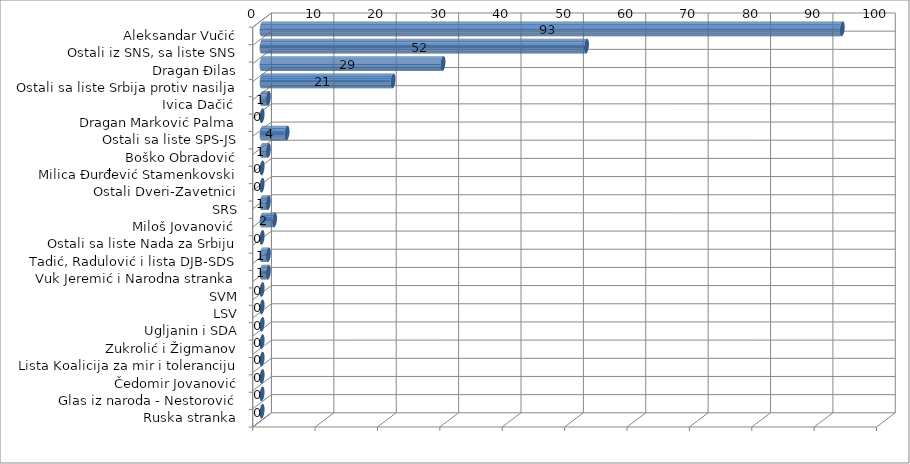
| Category | Series 0 |
|---|---|
| Aleksandar Vučić | 93 |
| Ostali iz SNS, sa liste SNS | 52 |
| Dragan Đilas | 29 |
| Ostali sa liste Srbija protiv nasilja | 21 |
| Ivica Dačić  | 1 |
| Dragan Marković Palma | 0 |
| Ostali sa liste SPS-JS | 4 |
| Boško Obradović | 1 |
| Milica Đurđević Stamenkovski | 0 |
| Ostali Dveri-Zavetnici | 0 |
| SRS | 1 |
| Miloš Jovanović  | 2 |
| Ostali sa liste Nada za Srbiju | 0 |
| Tadić, Radulović i lista DJB-SDS | 1 |
| Vuk Jeremić i Narodna stranka | 1 |
| SVM | 0 |
| LSV | 0 |
| Ugljanin i SDA | 0 |
| Zukrolić i Žigmanov | 0 |
| Lista Koalicija za mir i toleranciju | 0 |
| Čedomir Jovanović | 0 |
| Glas iz naroda - Nestorović | 0 |
| Ruska stranka | 0 |